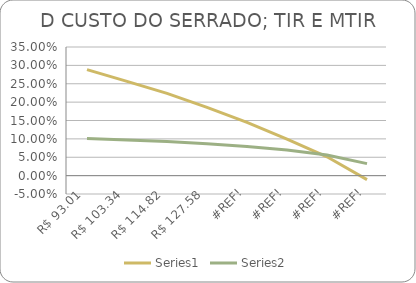
| Category | Series 0 | Series 1 |
|---|---|---|
| 93.00574404792488 | 0.288 | 0.101 |
| 103.33971560880542 | 0.256 | 0.097 |
| 114.82190623200601 | 0.224 | 0.093 |
| 127.57989581334002 | 0.186 | 0.087 |
| 0.0 | 0.145 | 0.079 |
| 0.0 | 0.1 | 0.07 |
| 0.0 | 0.051 | 0.056 |
| 0.0 | -0.011 | 0.033 |